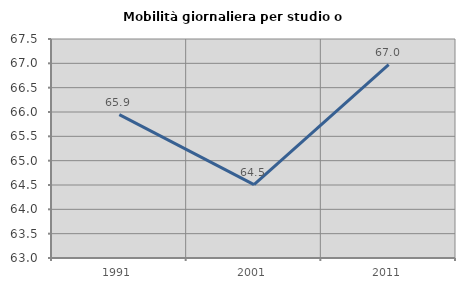
| Category | Mobilità giornaliera per studio o lavoro |
|---|---|
| 1991.0 | 65.946 |
| 2001.0 | 64.506 |
| 2011.0 | 66.972 |